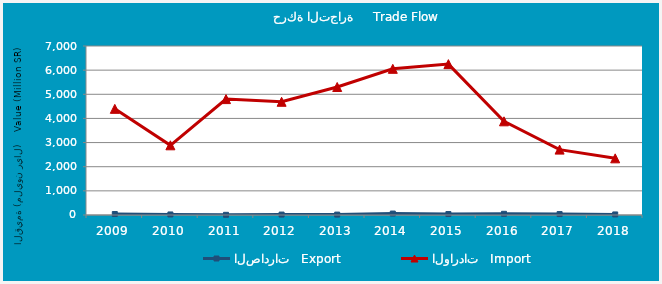
| Category | الصادرات   Export | الواردات   Import |
|---|---|---|
| 2009.0 | 40132372 | 4396728193 |
| 2010.0 | 22254071 | 2887058294 |
| 2011.0 | 7644227 | 4800236522 |
| 2012.0 | 17538661 | 4688971214 |
| 2013.0 | 16646967 | 5301874058 |
| 2014.0 | 60081759 | 6054683392 |
| 2015.0 | 39939165 | 6249099432 |
| 2016.0 | 49438262 | 3880509914 |
| 2017.0 | 38344734 | 2708062128 |
| 2018.0 | 23264840 | 2347052420 |